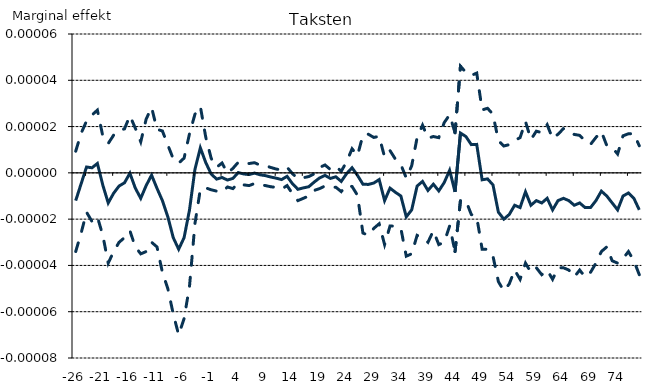
| Category | Estimat | Nedre konfidensgrænse | Øvre konfidensgrænse |
|---|---|---|---|
| -26.0 | 0 | 0 | 0 |
| -25.0 | 0 | 0 | 0 |
| -24.0 | 0 | 0 | 0 |
| -23.0 | 0 | 0 | 0 |
| -22.0 | 0 | 0 | 0 |
| -21.0 | 0 | 0 | 0 |
| -20.0 | 0 | 0 | 0 |
| -19.0 | 0 | 0 | 0 |
| -18.0 | 0 | 0 | 0 |
| -17.0 | 0 | 0 | 0 |
| -16.0 | 0 | 0 | 0 |
| -15.0 | 0 | 0 | 0 |
| -14.0 | 0 | 0 | 0 |
| -13.0 | 0 | 0 | 0 |
| -12.0 | 0 | 0 | 0 |
| -11.0 | 0 | 0 | 0 |
| -10.0 | 0 | 0 | 0 |
| -9.0 | 0 | 0 | 0 |
| -8.0 | 0 | 0 | 0 |
| -7.0 | 0 | 0 | 0 |
| -6.0 | 0 | 0 | 0 |
| -5.0 | 0 | 0 | 0 |
| -4.0 | 0 | 0 | 0 |
| -3.0 | 0 | 0 | 0 |
| -2.0 | 0 | 0 | 0 |
| -1.0 | 0 | 0 | 0 |
| 0.0 | 0 | 0 | 0 |
| 1.0 | 0 | 0 | 0 |
| 2.0 | 0 | 0 | 0 |
| 3.0 | 0 | 0 | 0 |
| 4.0 | 0 | 0 | 0 |
| 5.0 | 0 | 0 | 0 |
| 6.0 | 0 | 0 | 0 |
| 7.0 | 0 | 0 | 0 |
| 8.0 | 0 | 0 | 0 |
| 9.0 | 0 | 0 | 0 |
| 10.0 | 0 | 0 | 0 |
| 11.0 | 0 | 0 | 0 |
| 12.0 | 0 | 0 | 0 |
| 13.0 | 0 | 0 | 0 |
| 14.0 | 0 | 0 | 0 |
| 15.0 | 0 | 0 | 0 |
| 16.0 | 0 | 0 | 0 |
| 17.0 | 0 | 0 | 0 |
| 18.0 | 0 | 0 | 0 |
| 19.0 | 0 | 0 | 0 |
| 20.0 | 0 | 0 | 0 |
| 21.0 | 0 | 0 | 0 |
| 22.0 | 0 | 0 | 0 |
| 23.0 | 0 | 0 | 0 |
| 24.0 | 0 | 0 | 0 |
| 25.0 | 0 | 0 | 0 |
| 26.0 | 0 | 0 | 0 |
| 27.0 | 0 | 0 | 0 |
| 28.0 | 0 | 0 | 0 |
| 29.0 | 0 | 0 | 0 |
| 30.0 | 0 | 0 | 0 |
| 31.0 | 0 | 0 | 0 |
| 32.0 | 0 | 0 | 0 |
| 33.0 | 0 | 0 | 0 |
| 34.0 | 0 | 0 | 0 |
| 35.0 | 0 | 0 | 0 |
| 36.0 | 0 | 0 | 0 |
| 37.0 | 0 | 0 | 0 |
| 38.0 | 0 | 0 | 0 |
| 39.0 | 0 | 0 | 0 |
| 40.0 | 0 | 0 | 0 |
| 41.0 | 0 | 0 | 0 |
| 42.0 | 0 | 0 | 0 |
| 43.0 | 0 | 0 | 0 |
| 44.0 | 0 | 0 | 0 |
| 45.0 | 0 | 0 | 0 |
| 46.0 | 0 | 0 | 0 |
| 47.0 | 0 | 0 | 0 |
| 48.0 | 0 | 0 | 0 |
| 49.0 | 0 | 0 | 0 |
| 50.0 | 0 | 0 | 0 |
| 51.0 | 0 | 0 | 0 |
| 52.0 | 0 | 0 | 0 |
| 53.0 | 0 | 0 | 0 |
| 54.0 | 0 | 0 | 0 |
| 55.0 | 0 | 0 | 0 |
| 56.0 | 0 | 0 | 0 |
| 57.0 | 0 | 0 | 0 |
| 58.0 | 0 | 0 | 0 |
| 59.0 | 0 | 0 | 0 |
| 60.0 | 0 | 0 | 0 |
| 61.0 | 0 | 0 | 0 |
| 62.0 | 0 | 0 | 0 |
| 63.0 | 0 | 0 | 0 |
| 64.0 | 0 | 0 | 0 |
| 65.0 | 0 | 0 | 0 |
| 66.0 | 0 | 0 | 0 |
| 67.0 | 0 | 0 | 0 |
| 68.0 | 0 | 0 | 0 |
| 69.0 | 0 | 0 | 0 |
| 70.0 | 0 | 0 | 0 |
| 71.0 | 0 | 0 | 0 |
| 72.0 | 0 | 0 | 0 |
| 73.0 | 0 | 0 | 0 |
| 74.0 | 0 | 0 | 0 |
| 75.0 | 0 | 0 | 0 |
| 76.0 | 0 | 0 | 0 |
| 77.0 | 0 | 0 | 0 |
| 78.0 | 0 | 0 | 0 |